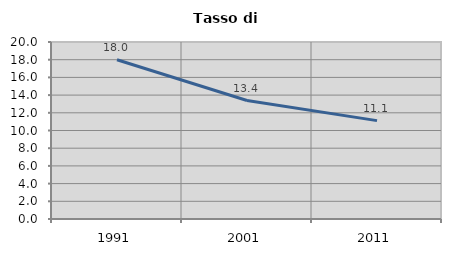
| Category | Tasso di disoccupazione   |
|---|---|
| 1991.0 | 18 |
| 2001.0 | 13.387 |
| 2011.0 | 11.116 |